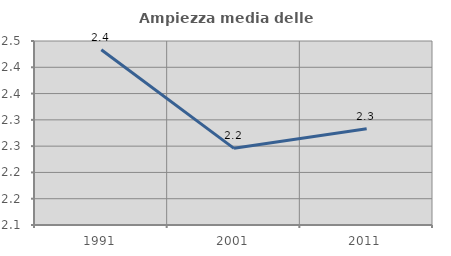
| Category | Ampiezza media delle famiglie |
|---|---|
| 1991.0 | 2.433 |
| 2001.0 | 2.246 |
| 2011.0 | 2.283 |